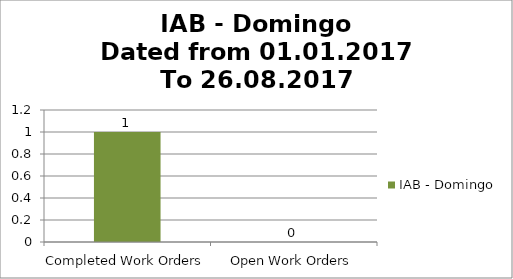
| Category | IAB - Domingo |
|---|---|
| Completed Work Orders | 1 |
| Open Work Orders | 0 |